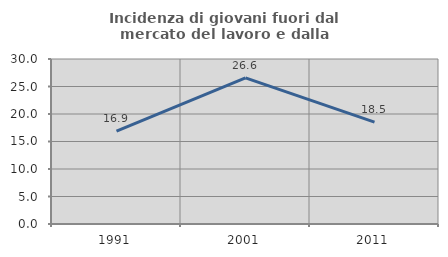
| Category | Incidenza di giovani fuori dal mercato del lavoro e dalla formazione  |
|---|---|
| 1991.0 | 16.867 |
| 2001.0 | 26.582 |
| 2011.0 | 18.519 |